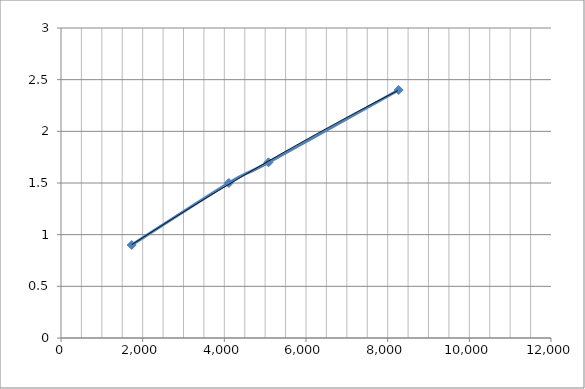
| Category | Series 0 |
|---|---|
| 1731.5462581025338 | 0.9 |
| 4110.399528579846 | 1.5 |
| 5081.360047142015 | 1.7 |
| 8269.347083087801 | 2.4 |